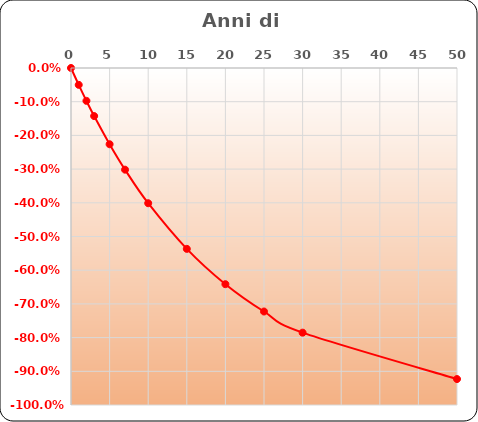
| Category | Perdita % capitale |
|---|---|
| 0.0 | 0 |
| 1.0 | -0.05 |
| 2.0 | -0.098 |
| 3.0 | -0.143 |
| 5.0 | -0.226 |
| 7.0 | -0.302 |
| 10.0 | -0.401 |
| 15.0 | -0.537 |
| 20.0 | -0.642 |
| 25.0 | -0.723 |
| 30.0 | -0.785 |
| 50.0 | -0.923 |